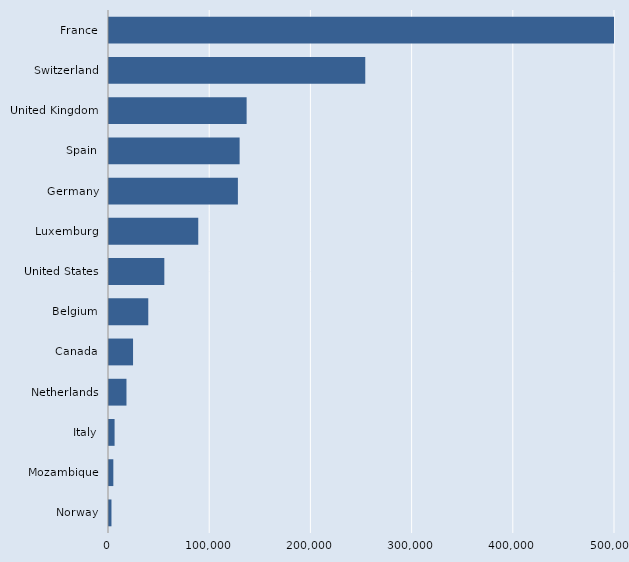
| Category | Series 0 |
|---|---|
| Norway | 2432 |
| Mozambique | 4279 |
| Italy | 5517 |
| Netherlands | 17266 |
| Canada | 23765 |
| Belgium | 38813 |
| United States | 54669 |
| Luxemburg | 88200 |
| Germany | 127368 |
| Spain | 129079 |
| United Kingdom | 136000 |
| Switzerland | 253227 |
| France | 501810 |